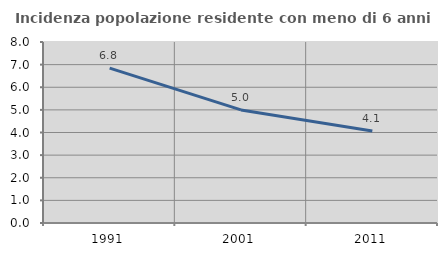
| Category | Incidenza popolazione residente con meno di 6 anni |
|---|---|
| 1991.0 | 6.844 |
| 2001.0 | 4.998 |
| 2011.0 | 4.064 |